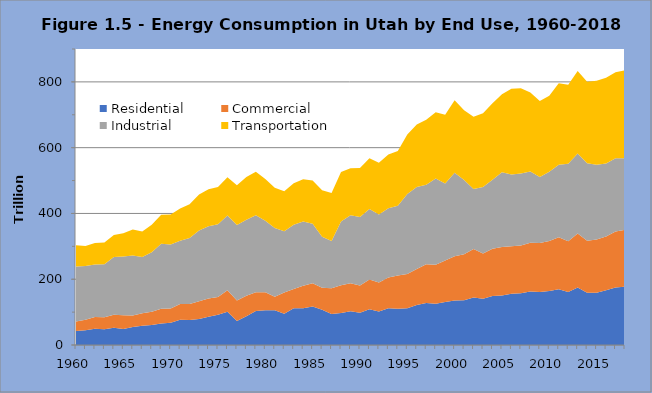
| Category | Residential  | Commercial  | Industrial | Transportation |
|---|---|---|---|---|
| 1960.0 | 42.296 | 28.943 | 167.479 | 64.511 |
| 1961.0 | 45.079 | 31.742 | 163.365 | 60.626 |
| 1962.0 | 49.329 | 35.949 | 159.126 | 65.915 |
| 1963.0 | 47.719 | 36.706 | 160.875 | 66.515 |
| 1964.0 | 52.213 | 39.697 | 175.674 | 66.941 |
| 1965.0 | 49.026 | 41.222 | 178.614 | 70.642 |
| 1966.0 | 54.604 | 35.09 | 182.39 | 78.749 |
| 1967.0 | 58.376 | 38.209 | 170.97 | 77.711 |
| 1968.0 | 60.714 | 40.509 | 180.909 | 83.491 |
| 1969.0 | 65.537 | 44.574 | 197.767 | 87.96 |
| 1970.0 | 67.572 | 43.437 | 194.466 | 91.544 |
| 1971.0 | 76.632 | 47.67 | 192.545 | 98.351 |
| 1972.0 | 76.323 | 48.209 | 200.45 | 103.196 |
| 1973.0 | 79.357 | 53.424 | 215.329 | 109.665 |
| 1974.0 | 85.517 | 55.855 | 219.873 | 112.423 |
| 1975.0 | 92.245 | 53.486 | 221.179 | 113.847 |
| 1976.0 | 100.962 | 65.384 | 227.639 | 116.248 |
| 1977.0 | 73.122 | 61.853 | 229.719 | 121.394 |
| 1978.0 | 87.161 | 62.804 | 230.565 | 130.166 |
| 1979.0 | 103.523 | 56.799 | 234.424 | 131.65 |
| 1980.0 | 105.649 | 55.099 | 217.064 | 126.763 |
| 1981.0 | 105.736 | 41.097 | 208.561 | 122.808 |
| 1982.0 | 94.746 | 64.871 | 186.138 | 121.883 |
| 1983.0 | 111.624 | 58.401 | 195.685 | 126.099 |
| 1984.0 | 111.515 | 68.298 | 195.717 | 128.479 |
| 1985.0 | 117.345 | 70.326 | 180.631 | 132.132 |
| 1986.0 | 107.404 | 66.601 | 154.872 | 141.909 |
| 1987.0 | 94.242 | 77.939 | 144.005 | 146.203 |
| 1988.0 | 97.565 | 83.839 | 193.78 | 151.122 |
| 1989.0 | 102.564 | 84.851 | 207.104 | 143.1 |
| 1990.0 | 97.824 | 83.147 | 208.447 | 148.687 |
| 1991.0 | 108.729 | 90.556 | 214.245 | 154.513 |
| 1992.0 | 101.906 | 88.212 | 206.774 | 157.455 |
| 1993.0 | 111.635 | 93.335 | 210.935 | 163.603 |
| 1994.0 | 110.108 | 101.351 | 211.637 | 166.811 |
| 1995.0 | 111.494 | 104.023 | 243.55 | 181.276 |
| 1996.0 | 121.5 | 109.949 | 249.254 | 189.839 |
| 1997.0 | 127.48 | 117.776 | 241.9 | 197.637 |
| 1998.0 | 125.441 | 118.477 | 261.977 | 202.063 |
| 1999.0 | 130.657 | 126.226 | 233.859 | 209.02 |
| 2000.0 | 135.521 | 133.972 | 254.196 | 220.791 |
| 2001.0 | 136.191 | 139.489 | 226.033 | 212.268 |
| 2002.0 | 144.558 | 147.503 | 181.947 | 219.787 |
| 2003.0 | 140.733 | 137.737 | 202.061 | 223.916 |
| 2004.0 | 148.612 | 143.832 | 210.318 | 232.666 |
| 2005.0 | 150.153 | 147.53 | 227.682 | 236.793 |
| 2006.0 | 155.495 | 144.928 | 218.34 | 260.512 |
| 2007.0 | 157.073 | 145.632 | 218.417 | 259.9 |
| 2008.0 | 163.033 | 148.046 | 216.727 | 240.23 |
| 2009.0 | 161.452 | 148.613 | 200.627 | 231.558 |
| 2010.0 | 163.999 | 152.55 | 210.259 | 230.992 |
| 2011.0 | 169.658 | 157.712 | 220.813 | 247.705 |
| 2012.0 | 160.868 | 154.839 | 235.311 | 240.521 |
| 2013.0 | 175.123 | 163.763 | 243.656 | 250.77 |
| 2014.0 | 159.065 | 157.655 | 236.054 | 247.303 |
| 2015.0 | 158.734 | 162.162 | 227.419 | 255.132 |
| 2016.0 | 166.165 | 164.05 | 221.726 | 260.812 |
| 2017.0 | 174.666 | 170.496 | 222.659 | 261.326 |
| 2018.0 | 177.18 | 173.093 | 217.77 | 267.078 |